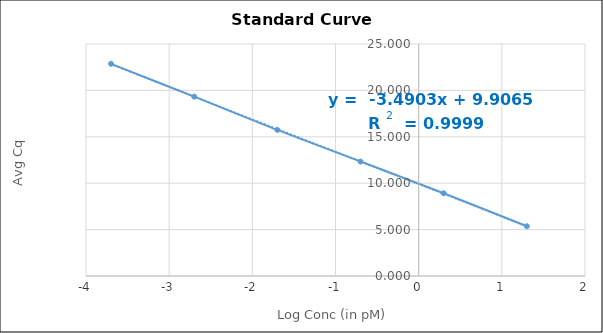
| Category | Series 0 |
|---|---|
| -3.6989700043360187 | 22.865 |
| -2.6989700043360187 | 19.33 |
| -1.6989700043360187 | 15.74 |
| -0.6989700043360187 | 12.334 |
| 0.3010299956639812 | 8.915 |
| 1.3010299956639813 | 5.363 |